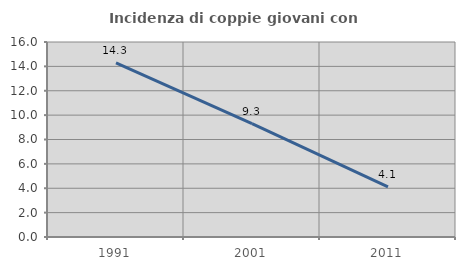
| Category | Incidenza di coppie giovani con figli |
|---|---|
| 1991.0 | 14.286 |
| 2001.0 | 9.309 |
| 2011.0 | 4.11 |